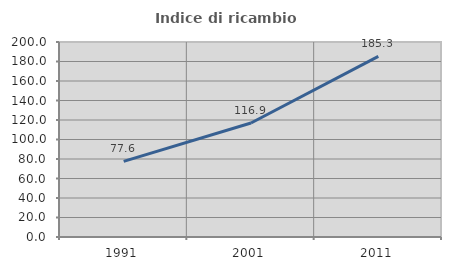
| Category | Indice di ricambio occupazionale  |
|---|---|
| 1991.0 | 77.551 |
| 2001.0 | 116.923 |
| 2011.0 | 185.294 |